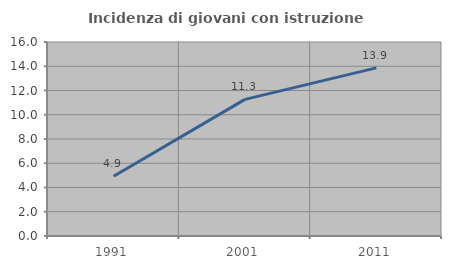
| Category | Incidenza di giovani con istruzione universitaria |
|---|---|
| 1991.0 | 4.932 |
| 2001.0 | 11.27 |
| 2011.0 | 13.865 |